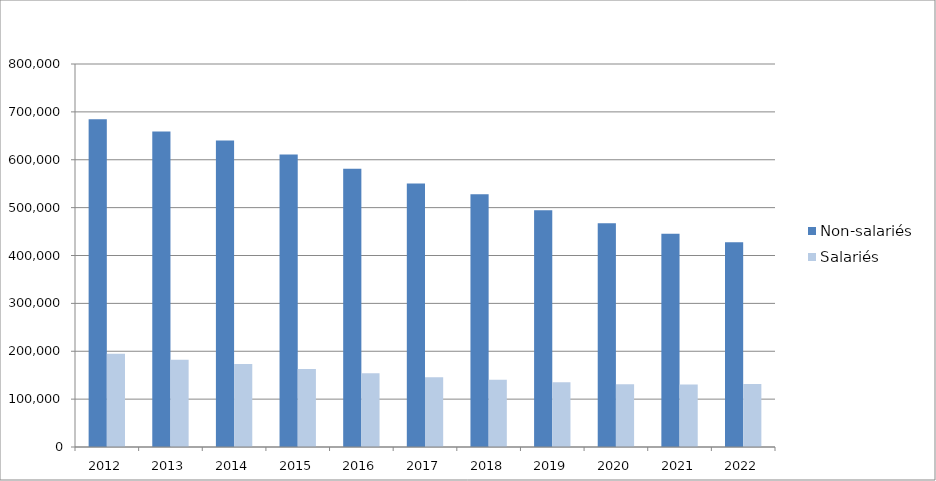
| Category | Non-salariés | Salariés |
|---|---|---|
| 2012.0 | 684599 | 194944 |
| 2013.0 | 659231 | 182051 |
| 2014.0 | 640145 | 173212 |
| 2015.0 | 611090 | 163079 |
| 2016.0 | 581329 | 154003 |
| 2017.0 | 550565 | 145809 |
| 2018.0 | 527736 | 140345 |
| 2019.0 | 494268 | 135119 |
| 2020.0 | 467127 | 131175 |
| 2021.0 | 445326 | 130346 |
| 2022.0 | 427926 | 131614 |